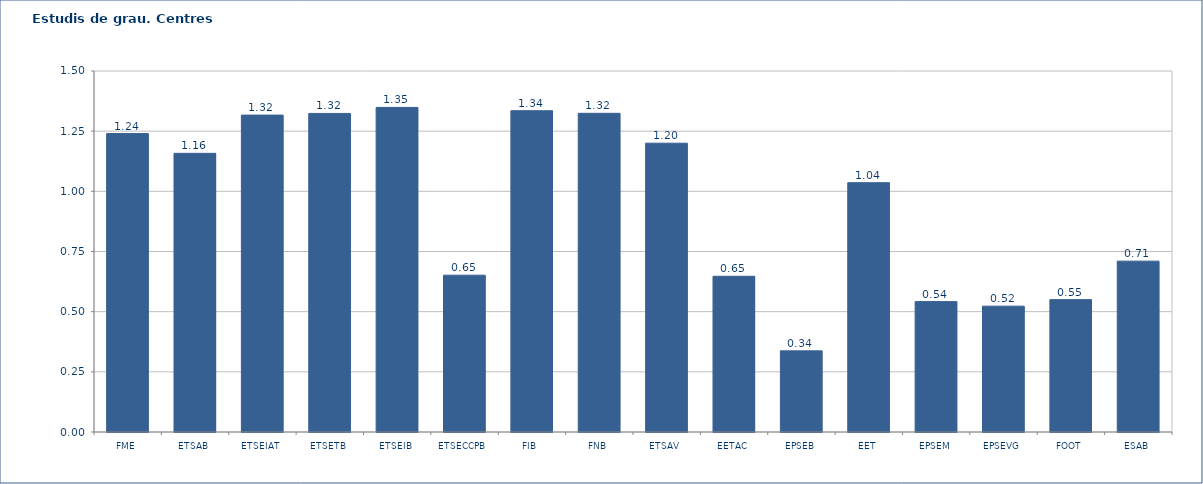
| Category | 2011-12 |
|---|---|
| FME | 1.24 |
| ETSAB | 1.158 |
| ETSEIAT | 1.317 |
| ETSETB | 1.324 |
| ETSEIB | 1.349 |
| ETSECCPB | 0.652 |
| FIB | 1.335 |
| FNB | 1.324 |
| ETSAV | 1.2 |
| EETAC | 0.647 |
| EPSEB | 0.337 |
| EET | 1.036 |
| EPSEM | 0.542 |
| EPSEVG | 0.523 |
| FOOT | 0.55 |
| ESAB | 0.71 |